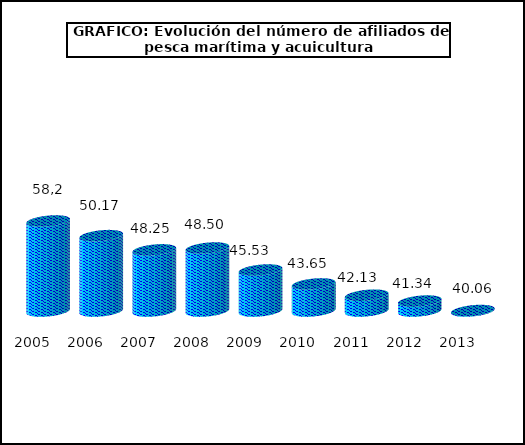
| Category | Series 0 |
|---|---|
| 2005.0 | 52.15 |
| 2006.0 | 50.17 |
| 2007.0 | 48.25 |
| 2008.0 | 48.5 |
| 2009.0 | 45.53 |
| 2010.0 | 43.65 |
| 2011.0 | 42.13 |
| 2012.0 | 41.34 |
| 2013.0 | 40.06 |